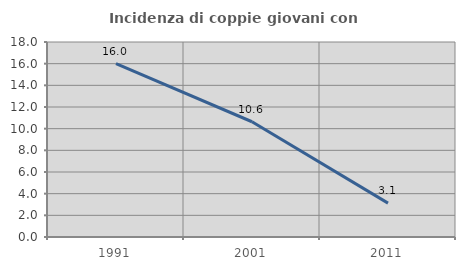
| Category | Incidenza di coppie giovani con figli |
|---|---|
| 1991.0 | 16 |
| 2001.0 | 10.638 |
| 2011.0 | 3.125 |